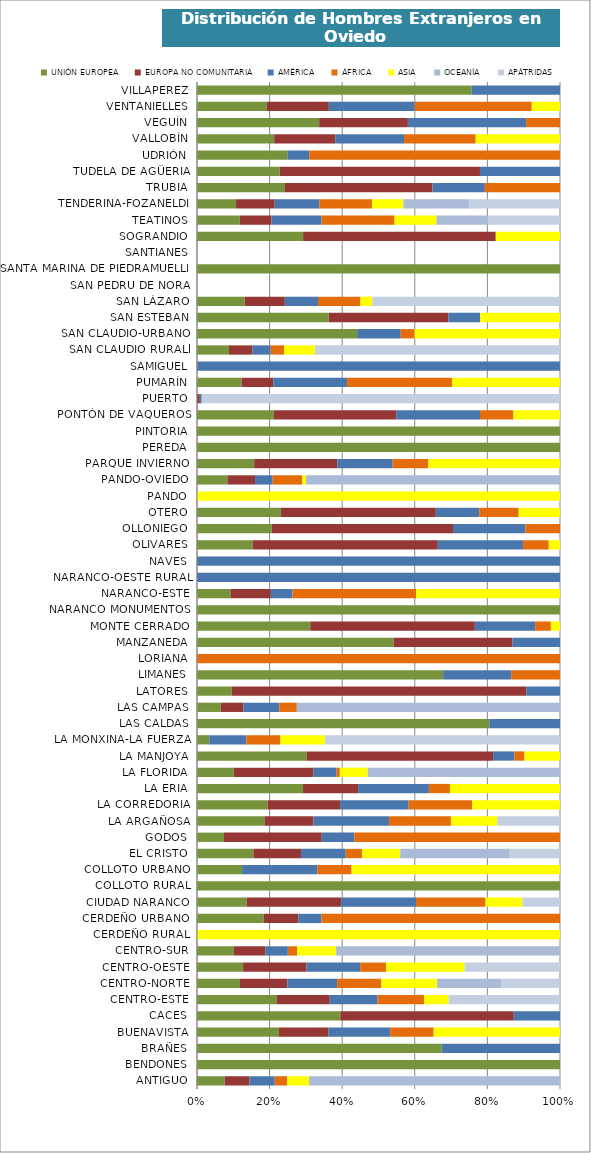
| Category | UNIÓN EUROPEA | EUROPA NO COMUNITARIA | AMÉRICA | ÁFRICA | ASIA | OCEANÍA | APÁTRIDAS |
|---|---|---|---|---|---|---|---|
| ANTIGUO | 0.02 | 0.018 | 0.018 | 0.009 | 0.016 | 0.182 | 0 |
| BENDONES | 0.001 | 0 | 0 | 0 | 0 | 0 | 0 |
| BRAÑES | 0.001 | 0 | 0 | 0 | 0 | 0 | 0 |
| BUENAVISTA | 0.055 | 0.034 | 0.042 | 0.029 | 0.086 | 0 | 0 |
| CACES | 0.002 | 0.002 | 0.001 | 0 | 0 | 0 | 0 |
| CENTRO-ESTE | 0.03 | 0.02 | 0.018 | 0.017 | 0.009 | 0 | 0.042 |
| CENTRO-NORTE | 0.061 | 0.067 | 0.071 | 0.063 | 0.079 | 0.091 | 0.083 |
| CENTRO-OESTE | 0.02 | 0.028 | 0.023 | 0.011 | 0.034 | 0 | 0.042 |
| CENTRO-SUR | 0.03 | 0.026 | 0.018 | 0.008 | 0.032 | 0.182 | 0 |
| CERDEÑO RURAL | 0 | 0 | 0 | 0 | 0.004 | 0 | 0 |
| CERDEÑO URBANO | 0.004 | 0.002 | 0.001 | 0.014 | 0 | 0 | 0 |
| CIUDAD NARANCO | 0.055 | 0.105 | 0.083 | 0.077 | 0.041 | 0 | 0.042 |
| COLLOTO RURAL | 0.001 | 0 | 0 | 0 | 0 | 0 | 0 |
| COLLOTO URBANO | 0.006 | 0 | 0.01 | 0.005 | 0.028 | 0 | 0 |
| EL CRISTO | 0.047 | 0.04 | 0.037 | 0.014 | 0.032 | 0.091 | 0.042 |
| GODOS | 0.001 | 0.004 | 0.001 | 0.008 | 0 | 0 | 0 |
| LA ARGAÑOSA | 0.09 | 0.065 | 0.101 | 0.082 | 0.062 | 0 | 0.083 |
| LA CORREDORIA | 0.054 | 0.055 | 0.052 | 0.048 | 0.067 | 0 | 0 |
| LA ERIA | 0.011 | 0.006 | 0.008 | 0.002 | 0.012 | 0 | 0 |
| LA FLORIDA | 0.017 | 0.038 | 0.011 | 0.002 | 0.013 | 0.091 | 0 |
| LA MANJOYA | 0.008 | 0.014 | 0.002 | 0.001 | 0.003 | 0 | 0 |
| LA MONXINA-LA FUERZA | 0.002 | 0 | 0.007 | 0.006 | 0.008 | 0 | 0.042 |
| LAS CALDAS | 0.001 | 0 | 0 | 0 | 0 | 0 | 0 |
| LAS CAMPAS | 0.008 | 0.008 | 0.012 | 0.006 | 0 | 0.091 | 0 |
| LATORES | 0.002 | 0.014 | 0.002 | 0 | 0 | 0 | 0 |
| LIMANES | 0.004 | 0 | 0.001 | 0.001 | 0 | 0 | 0 |
| LORIANA | 0 | 0 | 0 | 0.003 | 0 | 0 | 0 |
| MANZANEDA | 0.003 | 0.002 | 0.001 | 0 | 0 | 0 | 0 |
| MONTE CERRADO | 0.016 | 0.024 | 0.009 | 0.002 | 0.001 | 0 | 0 |
| NARANCO MONUMENTOS | 0.001 | 0 | 0 | 0 | 0 | 0 | 0 |
| NARANCO-ESTE | 0.005 | 0.006 | 0.003 | 0.018 | 0.021 | 0 | 0 |
| NARANCO-OESTE RURAL | 0 | 0 | 0 | 0 | 0 | 0 | 0 |
| NAVES | 0 | 0 | 0.001 | 0 | 0 | 0 | 0 |
| OLIVARES | 0.007 | 0.022 | 0.01 | 0.003 | 0.001 | 0 | 0 |
| OLLONIEGO | 0.002 | 0.004 | 0.002 | 0.001 | 0 | 0 | 0 |
| OTERO | 0.032 | 0.059 | 0.017 | 0.015 | 0.016 | 0 | 0 |
| PANDO | 0 | 0 | 0 | 0 | 0.001 | 0 | 0 |
| PANDO-OVIEDO | 0.011 | 0.01 | 0.006 | 0.011 | 0.001 | 0.091 | 0 |
| PARQUE INVIERNO | 0.011 | 0.016 | 0.011 | 0.007 | 0.025 | 0 | 0 |
| PEREDA | 0.001 | 0 | 0 | 0 | 0 | 0 | 0 |
| PINTORIA | 0.001 | 0 | 0 | 0 | 0 | 0 | 0 |
| PONTÓN DE VAQUEROS | 0.009 | 0.014 | 0.009 | 0.004 | 0.005 | 0 | 0 |
| PUERTO | 0 | 0.002 | 0.001 | 0 | 0 | 0 | 0.25 |
| PUMARÍN | 0.07 | 0.049 | 0.115 | 0.164 | 0.169 | 0 | 0 |
| SAMIGUEL | 0 | 0 | 0 | 0 | 0 | 0 | 0 |
| SAN CLAUDIO RURALl | 0.005 | 0.004 | 0.003 | 0.002 | 0.005 | 0 | 0.042 |
| SAN CLAUDIO-URBANO | 0.009 | 0 | 0.002 | 0.001 | 0.008 | 0 | 0 |
| SAN ESTEBAN | 0.002 | 0.002 | 0.001 | 0 | 0.001 | 0 | 0 |
| SAN LÁZARO | 0.021 | 0.018 | 0.015 | 0.019 | 0.005 | 0 | 0.083 |
| SAN PEDRU DE NORA | 0 | 0 | 0 | 0 | 0 | 0 | 0 |
| SANTA MARINA DE PIEDRAMUELLE | 0.004 | 0 | 0 | 0 | 0 | 0 | 0 |
| SANTIANES | 0 | 0 | 0 | 0 | 0 | 0 | 0 |
| SOGRANDIO | 0.002 | 0.004 | 0 | 0 | 0.001 | 0 | 0 |
| TEATINOS | 0.075 | 0.055 | 0.088 | 0.128 | 0.074 | 0.091 | 0.125 |
| TENDERINA-FOZANELDI | 0.054 | 0.053 | 0.062 | 0.073 | 0.043 | 0.091 | 0.125 |
| TRUBIA | 0.007 | 0.012 | 0.004 | 0.006 | 0 | 0 | 0 |
| TUDELA DE AGÜERIA | 0.002 | 0.004 | 0.002 | 0 | 0 | 0 | 0 |
| UDRIÓN | 0.001 | 0 | 0 | 0.003 | 0 | 0 | 0 |
| VALLOBÍN | 0.072 | 0.057 | 0.064 | 0.067 | 0.079 | 0 | 0 |
| VEGUÍN | 0.003 | 0.002 | 0.003 | 0.001 | 0 | 0 | 0 |
| VENTANIELLES | 0.042 | 0.038 | 0.052 | 0.071 | 0.017 | 0 | 0 |
| VILLAPEREZ | 0.002 | 0 | 0.001 | 0 | 0 | 0 | 0 |